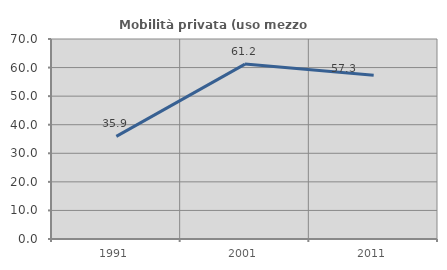
| Category | Mobilità privata (uso mezzo privato) |
|---|---|
| 1991.0 | 35.938 |
| 2001.0 | 61.224 |
| 2011.0 | 57.273 |